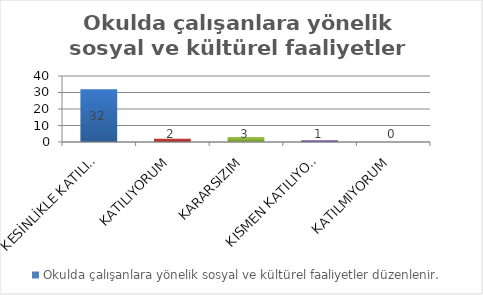
| Category | Okulda çalışanlara yönelik sosyal ve kültürel faaliyetler düzenlenir. |
|---|---|
| KESİNLİKLE KATILIYORUM | 32 |
| KATILIYORUM | 2 |
| KARARSIZIM | 3 |
| KISMEN KATILIYORUM | 1 |
| KATILMIYORUM | 0 |